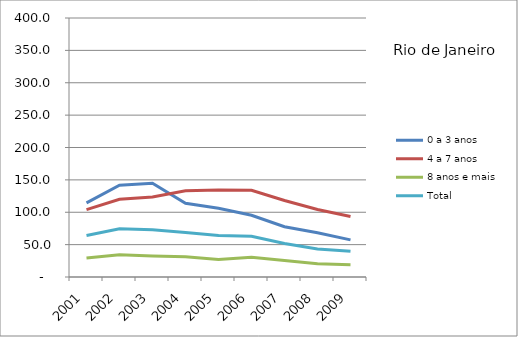
| Category | 0 a 3 anos | 4 a 7 anos | 8 anos e mais | Total |
|---|---|---|---|---|
| 2001.0 | 114.5 | 104.1 | 29.4 | 64 |
| 2002.0 | 141.8 | 120.1 | 34.4 | 74.5 |
| 2003.0 | 144.8 | 123.5 | 32.5 | 72.8 |
| 2004.0 | 113.9 | 133.3 | 31.2 | 68.8 |
| 2005.0 | 106.1 | 134.5 | 27 | 64.1 |
| 2006.0 | 95.4 | 133.8 | 30.5 | 62.9 |
| 2007.0 | 77.7 | 118.1 | 25.6 | 51.7 |
| 2008.0 | 68.3 | 104.3 | 20.3 | 43.4 |
| 2009.0 | 57.3 | 93.5 | 18.9 | 39.6 |